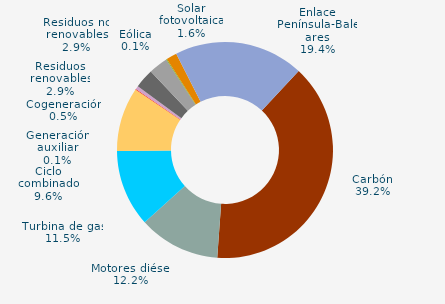
| Category | Series 0 |
|---|---|
| Carbón | 39.2 |
| Motores diésel | 12.2 |
| Turbina de gas | 11.5 |
| Ciclo combinado | 9.6 |
| Generación auxiliar | 0.1 |
| Cogeneración | 0.5 |
| Residuos no renovables | 2.9 |
| Residuos renovables | 2.9 |
| Eólica | 0.1 |
| Solar fotovoltaica | 1.6 |
| Otras renovables | 0 |
| Enlace Península-Baleares | 19.4 |